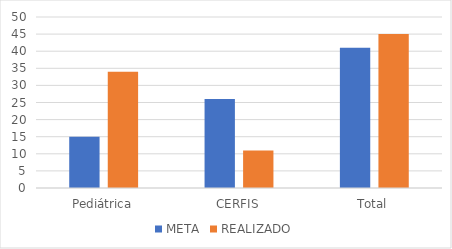
| Category | META | REALIZADO |
|---|---|---|
| Pediátrica | 15 | 34 |
| CERFIS | 26 | 11 |
| Total | 41 | 45 |